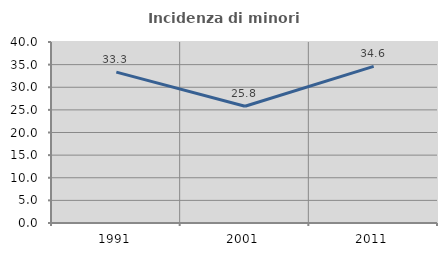
| Category | Incidenza di minori stranieri |
|---|---|
| 1991.0 | 33.333 |
| 2001.0 | 25.806 |
| 2011.0 | 34.615 |